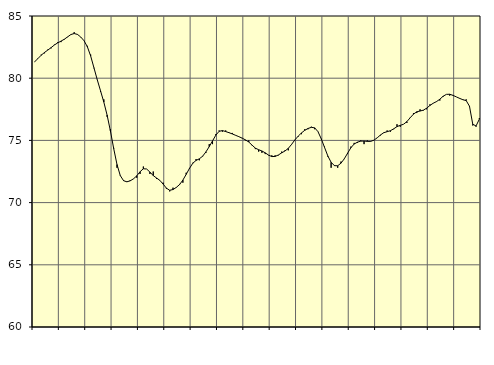
| Category | Piggar | Series 1 |
|---|---|---|
| nan | 81.3 | 81.32 |
| 87.0 | 81.6 | 81.58 |
| 87.0 | 81.9 | 81.85 |
| 87.0 | 82 | 82.07 |
| nan | 82.3 | 82.26 |
| 88.0 | 82.4 | 82.46 |
| 88.0 | 82.7 | 82.67 |
| 88.0 | 82.9 | 82.84 |
| nan | 82.9 | 82.98 |
| 89.0 | 83.1 | 83.13 |
| 89.0 | 83.3 | 83.32 |
| 89.0 | 83.5 | 83.51 |
| nan | 83.7 | 83.59 |
| 90.0 | 83.5 | 83.52 |
| 90.0 | 83.3 | 83.31 |
| 90.0 | 83 | 83.01 |
| nan | 82.6 | 82.53 |
| 91.0 | 81.9 | 81.79 |
| 91.0 | 80.8 | 80.84 |
| 91.0 | 79.9 | 79.88 |
| nan | 78.9 | 78.99 |
| 92.0 | 78.3 | 78.08 |
| 92.0 | 76.9 | 77.03 |
| 92.0 | 75.9 | 75.76 |
| nan | 74.4 | 74.34 |
| 93.0 | 72.8 | 73.06 |
| 93.0 | 72.2 | 72.17 |
| 93.0 | 71.8 | 71.76 |
| nan | 71.7 | 71.67 |
| 94.0 | 71.8 | 71.75 |
| 94.0 | 71.9 | 71.91 |
| 94.0 | 72 | 72.15 |
| nan | 72.3 | 72.48 |
| 95.0 | 72.9 | 72.72 |
| 95.0 | 72.7 | 72.7 |
| 95.0 | 72.3 | 72.45 |
| nan | 72.5 | 72.17 |
| 96.0 | 71.9 | 71.98 |
| 96.0 | 71.8 | 71.79 |
| 96.0 | 71.6 | 71.49 |
| nan | 71.1 | 71.16 |
| 97.0 | 70.9 | 70.99 |
| 97.0 | 71.2 | 71.05 |
| 97.0 | 71.2 | 71.22 |
| nan | 71.5 | 71.45 |
| 98.0 | 71.6 | 71.81 |
| 98.0 | 72.4 | 72.27 |
| 98.0 | 72.7 | 72.75 |
| nan | 73.2 | 73.16 |
| 99.0 | 73.5 | 73.39 |
| 99.0 | 73.4 | 73.52 |
| 99.0 | 73.7 | 73.73 |
| nan | 74 | 74.08 |
| 0.0 | 74.7 | 74.5 |
| 0.0 | 74.7 | 74.96 |
| 0.0 | 75.5 | 75.42 |
| nan | 75.8 | 75.73 |
| 1.0 | 75.7 | 75.79 |
| 1.0 | 75.8 | 75.71 |
| 1.0 | 75.6 | 75.62 |
| nan | 75.6 | 75.52 |
| 2.0 | 75.4 | 75.41 |
| 2.0 | 75.3 | 75.3 |
| 2.0 | 75.2 | 75.18 |
| nan | 75 | 75.04 |
| 3.0 | 75 | 74.87 |
| 3.0 | 74.6 | 74.62 |
| 3.0 | 74.3 | 74.38 |
| nan | 74.1 | 74.25 |
| 4.0 | 74 | 74.15 |
| 4.0 | 73.9 | 74 |
| 4.0 | 73.8 | 73.82 |
| nan | 73.8 | 73.7 |
| 5.0 | 73.8 | 73.71 |
| 5.0 | 73.8 | 73.83 |
| 5.0 | 74.1 | 74 |
| nan | 74.2 | 74.15 |
| 6.0 | 74.2 | 74.36 |
| 6.0 | 74.7 | 74.68 |
| 6.0 | 75 | 75.04 |
| nan | 75.3 | 75.34 |
| 7.0 | 75.5 | 75.6 |
| 7.0 | 75.9 | 75.81 |
| 7.0 | 75.9 | 75.96 |
| nan | 76.1 | 76.05 |
| 8.0 | 75.9 | 76.01 |
| 8.0 | 75.7 | 75.71 |
| 8.0 | 75.1 | 75.13 |
| nan | 74.5 | 74.44 |
| 9.0 | 73.7 | 73.75 |
| 9.0 | 72.8 | 73.24 |
| 9.0 | 73 | 72.97 |
| nan | 72.8 | 72.96 |
| 10.0 | 73.3 | 73.17 |
| 10.0 | 73.5 | 73.52 |
| 10.0 | 73.9 | 73.97 |
| nan | 74.5 | 74.41 |
| 11.0 | 74.8 | 74.71 |
| 11.0 | 74.8 | 74.86 |
| 11.0 | 75 | 74.94 |
| nan | 74.7 | 74.95 |
| 12.0 | 75 | 74.92 |
| 12.0 | 74.9 | 74.92 |
| 12.0 | 75 | 75.02 |
| nan | 75.2 | 75.21 |
| 13.0 | 75.4 | 75.44 |
| 13.0 | 75.6 | 75.62 |
| 13.0 | 75.8 | 75.7 |
| nan | 75.7 | 75.78 |
| 14.0 | 75.9 | 75.93 |
| 14.0 | 76.3 | 76.11 |
| 14.0 | 76.1 | 76.21 |
| nan | 76.3 | 76.3 |
| 15.0 | 76.4 | 76.51 |
| 15.0 | 76.8 | 76.82 |
| 15.0 | 77.2 | 77.11 |
| nan | 77.2 | 77.3 |
| 16.0 | 77.5 | 77.36 |
| 16.0 | 77.4 | 77.43 |
| 16.0 | 77.5 | 77.59 |
| nan | 77.9 | 77.81 |
| 17.0 | 78 | 77.99 |
| 17.0 | 78.1 | 78.12 |
| 17.0 | 78.2 | 78.31 |
| nan | 78.5 | 78.55 |
| 18.0 | 78.7 | 78.7 |
| 18.0 | 78.6 | 78.71 |
| 18.0 | 78.6 | 78.62 |
| nan | 78.5 | 78.5 |
| 19.0 | 78.4 | 78.38 |
| 19.0 | 78.3 | 78.27 |
| 19.0 | 78.3 | 78.2 |
| nan | 77.7 | 77.75 |
| 20.0 | 76.2 | 76.3 |
| 20.0 | 76.1 | 76.16 |
| 20.0 | 76.8 | 76.71 |